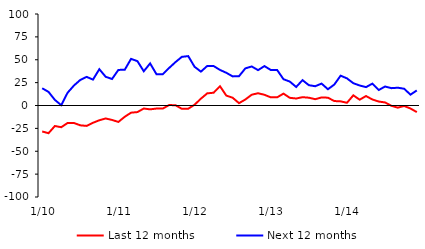
| Category | Last 12 months | Next 12 months |
|---|---|---|
|  1/10 | -28.38 | 18.87 |
|  2/10 | -30.28 | 14.86 |
|  3/10 | -22.41 | 6.12 |
|  4/10 | -23.71 | 0.35 |
|  5/10 | -19.08 | 13.92 |
|  6/10 | -19.11 | 21.81 |
|  7/10 | -21.66 | 27.94 |
|  8/10 | -22.29 | 31.28 |
|  9/10 | -18.88 | 28.29 |
|  10/10 | -16.12 | 39.67 |
|  11/10 | -14.18 | 31.39 |
|  12/10 | -15.78 | 28.96 |
|  1/11 | -17.96 | 38.89 |
|  2/11 | -12.33 | 39.05 |
|  3/11 | -7.84 | 50.96 |
|  4/11 | -7.2 | 48.47 |
|  5/11 | -3.3 | 37.42 |
|  6/11 | -4.21 | 45.99 |
|  7/11 | -3.33 | 34.17 |
|  8/11 | -3.33 | 34.17 |
|  9/11 | 0.51 | 41.09 |
|  10/11 | 0.28 | 47.47 |
|  11/11 | -3.65 | 53.17 |
|  12/11 | -3.52 | 53.99 |
|  1/12 | 0.85 | 42.3 |
|  2/12 | 7.49 | 37.02 |
|  3/12 | 13.29 | 43.26 |
|  4/12 | 13.96 | 43.14 |
|  5/12 | 21.08 | 38.87 |
|  6/12 | 10.81 | 35.74 |
|  7/12 | 8.46 | 31.81 |
|  8/12 | 2.55 | 32.03 |
|  9/12 | 6.58 | 40.6 |
|  10/12 | 11.79 | 42.65 |
|  11/12 | 13.41 | 38.66 |
|  12/12 | 11.71 | 43.07 |
|  1/13 | 8.92 | 38.82 |
|  2/13 | 8.92 | 38.82 |
|  3/13 | 12.98 | 28.75 |
|  4/13 | 8.4 | 26.12 |
|  5/13 | 7.64 | 20.26 |
|  6/13 | 9.1 | 27.71 |
|  7/13 | 8.51 | 22.2 |
|  8/13 | 6.89 | 21.06 |
|  9/13 | 8.81 | 23.95 |
|  10/13 | 8.54 | 17.76 |
|  11/13 | 4.88 | 22.87 |
|  12/13 | 4.53 | 32.62 |
|  1/14 | 2.99 | 29.64 |
|  2/14 | 11.1 | 24.37 |
|  3/14 | 6.35 | 21.86 |
|  4/14 | 10.34 | 20.09 |
|  5/14 | 6.57 | 23.91 |
|  6/14 | 4.33 | 16.91 |
|  7/14 | 3.35 | 20.75 |
|  8/14 | -0.33 | 18.95 |
|  9/14 | -2.37 | 19.44 |
|  10/14 | -0.5 | 18.32 |
|  11/14 | -3.3 | 11.85 |
|  12/14 | -7.21 | 16.46 |